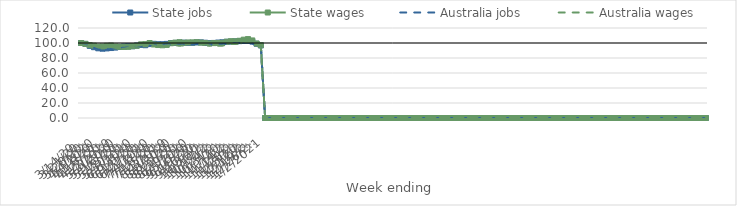
| Category | State jobs | State wages | Australia jobs | Australia wages |
|---|---|---|---|---|
| 14/03/2020 | 100 | 100 | 100 | 100 |
| 21/03/2020 | 98.792 | 98.837 | 99.218 | 99.669 |
| 28/03/2020 | 96.174 | 97.166 | 96.159 | 98.38 |
| 04/04/2020 | 94.404 | 96.43 | 93.511 | 96.663 |
| 11/04/2020 | 92.918 | 95.204 | 91.845 | 94.08 |
| 18/04/2020 | 92.413 | 95.422 | 91.454 | 93.993 |
| 25/04/2020 | 92.776 | 96.268 | 91.82 | 94.131 |
| 02/05/2020 | 93.282 | 96.653 | 92.24 | 94.625 |
| 09/05/2020 | 93.891 | 95.436 | 92.814 | 93.438 |
| 16/05/2020 | 94.737 | 94.982 | 93.355 | 92.628 |
| 23/05/2020 | 95.428 | 94.935 | 93.675 | 92.257 |
| 30/05/2020 | 95.698 | 94.852 | 94.182 | 93.555 |
| 06/06/2020 | 95.673 | 95.769 | 95.129 | 95.487 |
| 13/06/2020 | 96.605 | 96.285 | 95.64 | 96.179 |
| 20/06/2020 | 97.347 | 98.226 | 95.803 | 97.167 |
| 27/06/2020 | 97.04 | 98.469 | 95.768 | 97.377 |
| 04/07/2020 | 98.539 | 99.98 | 97.026 | 99.465 |
| 11/07/2020 | 98.875 | 98.03 | 97.722 | 96.839 |
| 18/07/2020 | 98.382 | 97.273 | 97.64 | 96.355 |
| 25/07/2020 | 98.373 | 96.953 | 97.768 | 96.035 |
| 01/08/2020 | 98.83 | 97.409 | 97.912 | 96.762 |
| 08/08/2020 | 99.996 | 99.651 | 97.848 | 97.159 |
| 15/08/2020 | 100.13 | 100.484 | 97.715 | 96.636 |
| 22/08/2020 | 100.391 | 101.06 | 97.726 | 96.439 |
| 29/08/2020 | 100.443 | 100.28 | 97.792 | 96.622 |
| 05/09/2020 | 100.184 | 100.686 | 97.988 | 99.323 |
| 12/09/2020 | 100.206 | 100.793 | 98.415 | 100.272 |
| 19/09/2020 | 100.802 | 101.063 | 98.579 | 101.043 |
| 26/09/2020 | 100.829 | 100.513 | 98.452 | 100.421 |
| 03/10/2020 | 100.37 | 100.01 | 97.813 | 98.297 |
| 10/10/2020 | 99.864 | 99.304 | 97.688 | 96.578 |
| 17/10/2020 | 100.084 | 99.852 | 98.252 | 97.02 |
| 24/10/2020 | 100.567 | 100.048 | 98.419 | 96.422 |
| 31/10/2020 | 100.925 | 100.218 | 98.499 | 96.422 |
| 07/11/2020 | 101.566 | 101.724 | 98.826 | 97.695 |
| 14/11/2020 | 101.756 | 102.412 | 99.425 | 98.506 |
| 21/11/2020 | 102.214 | 102.193 | 99.648 | 98.519 |
| 28/11/2020 | 102.45 | 102.981 | 99.873 | 99.566 |
| 05/12/2020 | 102.722 | 104.451 | 100.204 | 100.773 |
| 12/12/2020 | 102.811 | 105.229 | 100.228 | 101.122 |
| 19/12/2020 | 101.924 | 103.422 | 99.39 | 101.653 |
| 26/12/2020 | 98.981 | 99.349 | 96.352 | 97.474 |
| 02/01/2021 | 96.77 | 97.135 | 93.927 | 93.755 |